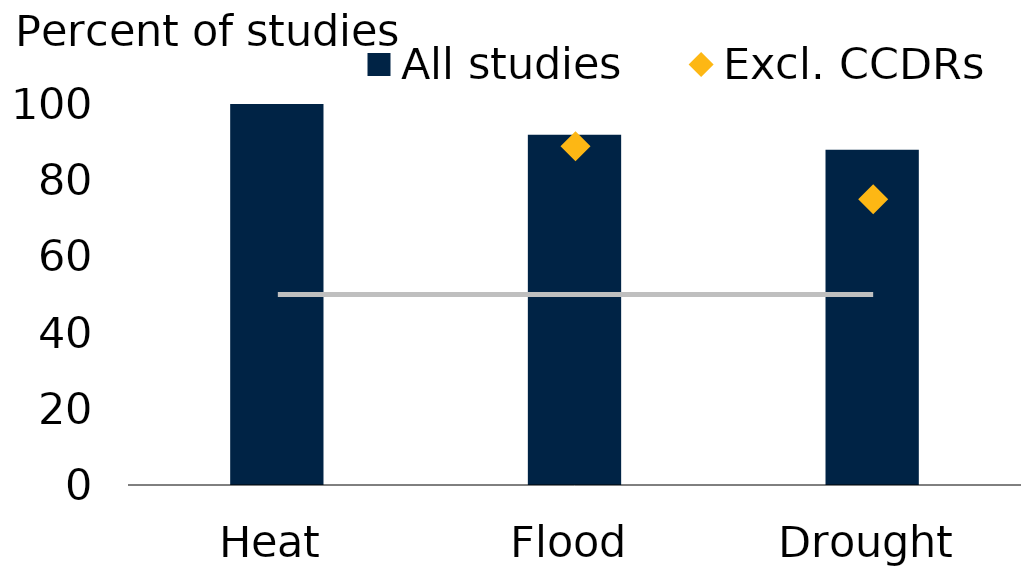
| Category | All studies |
|---|---|
| Heat | 100 |
| Flood | 91.9 |
| Drought | 88 |